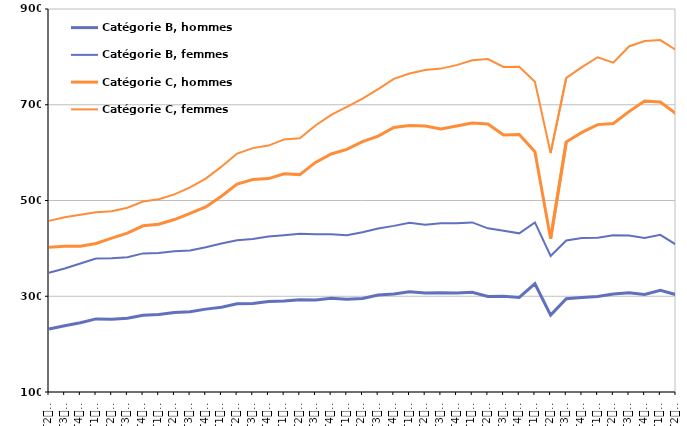
| Category | Catégorie B, hommes | Catégorie B, femmes | Catégorie C, hommes | Catégorie C, femmes |
|---|---|---|---|---|
| T2
2012 | 231.4 | 349.1 | 402.3 | 457.4 |
| T3
2012 | 238.3 | 358 | 404.3 | 464.8 |
| T4
2012 | 244.6 | 368.4 | 404.5 | 470 |
| T1
2013 | 252.7 | 378.8 | 410.3 | 475.5 |
| T2
2013 | 252.2 | 379.4 | 421.3 | 477.5 |
| T3
2013 | 254.2 | 381.6 | 431.9 | 484.9 |
| T4
2013 | 260.4 | 389.5 | 447.2 | 497.8 |
| T1
2014 | 262.1 | 390.4 | 450.4 | 502.6 |
| T2
2014 | 265.9 | 394.2 | 460.2 | 512.7 |
| T3
2014 | 267.7 | 395.6 | 472.9 | 527.4 |
| T4
2014 | 273.1 | 402.4 | 486.7 | 545.7 |
| T1
2015 | 276.9 | 410.1 | 509 | 570.7 |
| T2
2015 | 284.2 | 417.1 | 534.2 | 598.1 |
| T3
2015 | 284.8 | 419.4 | 543.9 | 609.4 |
| T4
2015 | 288.9 | 424.9 | 545.7 | 614.7 |
| T1
2016 | 290 | 427.5 | 555.9 | 627.6 |
| T2
2016 | 292.6 | 430.5 | 554.1 | 630.2 |
| T3
2016 | 292.3 | 429.5 | 579.6 | 656.8 |
| T4
2016 | 295.6 | 429.3 | 597.2 | 678.7 |
| T1
2017 | 293.8 | 427.2 | 606.9 | 695.5 |
| T2
2017 | 295.3 | 433.7 | 623.1 | 712.6 |
| T3
2017 | 302.5 | 441.4 | 634.4 | 732.8 |
| T4
2017 | 304.8 | 447 | 652.7 | 754 |
| T1
2018 | 309.3 | 453.5 | 656.8 | 765.3 |
| T2
2018 | 306.8 | 449.5 | 655.6 | 772.7 |
| T3
2018 | 307.3 | 452.5 | 649.2 | 775.5 |
| T4
2018 | 306.7 | 452.3 | 655.6 | 782.8 |
| T1
2019 | 308.2 | 454.2 | 661.8 | 792.8 |
| T2
2019 | 299.7 | 441.9 | 659.9 | 795.5 |
| T3
2019 | 300 | 436.9 | 636.8 | 779.1 |
| T4
2019 | 297.5 | 431.4 | 637.8 | 779.2 |
| T1
2020 | 326.2 | 454.2 | 602 | 748 |
| T2
2020 | 260.6 | 384 | 420.1 | 599.2 |
| T3
2020 | 294.9 | 416.6 | 622.6 | 756 |
| T4
2020 | 297.6 | 421.7 | 642.2 | 778.7 |
| T1
2021 | 299.7 | 422.3 | 658.5 | 799.2 |
| T2
2021 | 304.7 | 427.3 | 660.8 | 788 |
| T3
2021 | 307.5 | 426.9 | 685.7 | 821.8 |
| T4
2021 | 303.9 | 421.9 | 707.7 | 833.3 |
| T1
2022 | 312.4 | 428.2 | 705.8 | 835 |
| T2
2022 | 303.4 | 407.9 | 681.6 | 814.5 |